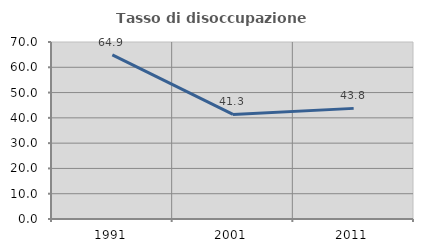
| Category | Tasso di disoccupazione giovanile  |
|---|---|
| 1991.0 | 64.935 |
| 2001.0 | 41.346 |
| 2011.0 | 43.75 |